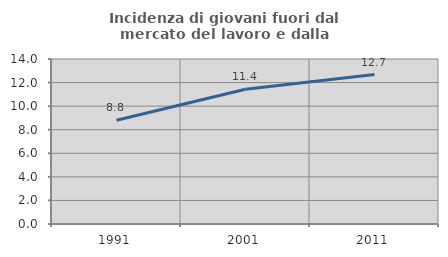
| Category | Incidenza di giovani fuori dal mercato del lavoro e dalla formazione  |
|---|---|
| 1991.0 | 8.805 |
| 2001.0 | 11.429 |
| 2011.0 | 12.676 |